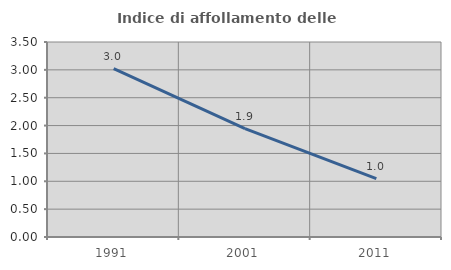
| Category | Indice di affollamento delle abitazioni  |
|---|---|
| 1991.0 | 3.02 |
| 2001.0 | 1.946 |
| 2011.0 | 1.049 |